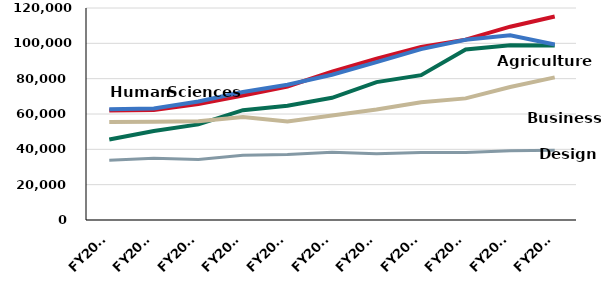
| Category | Agriculture and Life Sciences | Business | Design | Engineering | Human Sciences |
|---|---|---|---|---|---|
| FY2007 | 45551 | 55410 | 33868 | 61948 | 62661 |
| FY2008 | 50358 | 55553 | 34943 | 62324 | 63180 |
| FY2009 | 54126 | 55849 | 34304 | 65639 | 67074 |
| FY2010 | 62143 | 58234 | 36700 | 70483 | 72434 |
| FY2011 | 64722 | 55747 | 37100 | 75584 | 76540 |
| FY2012 | 69169 | 59198 | 38341 | 83983 | 82203 |
| FY2013 | 78068 | 62513 | 37527 | 91384 | 89364 |
| FY2014 | 82008 | 66699 | 38237 | 97881 | 96719 |
| FY2015 | 96557.96 | 68837.4 | 38250.21 | 102114.42 | 102030.75 |
| FY2016 | 98944.95 | 75306.29 | 39154.82 | 109416.59 | 104526.39 |
| FY2017 | 98751.123 | 80738.15 | 39447.34 | 115228.603 | 99360.868 |